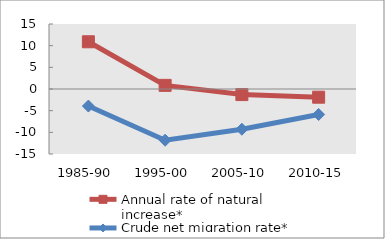
| Category | Annual rate of natural increase* | Crude net migration rate* |
|---|---|---|
| 1985-90 | 10.898 | -3.941 |
| 1995-00 | 0.837 | -11.819 |
| 2005-10 | -1.29 | -9.285 |
| 2010-15 | -1.892 | -5.88 |